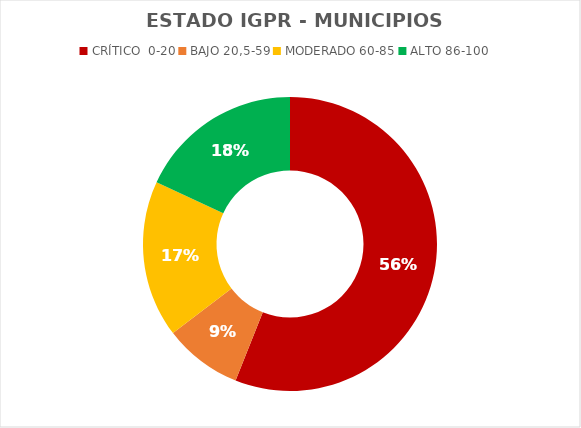
| Category | Series 0 |
|---|---|
| 0 | 65 |
| 1 | 10 |
| 2 | 20 |
| 3 | 21 |